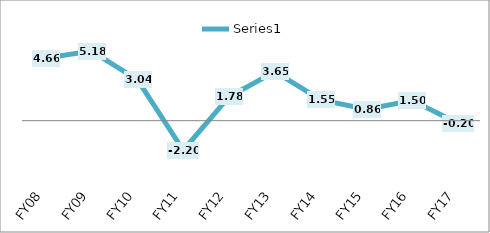
| Category | Series 0 |
|---|---|
| FY08 | 4.66 |
| FY09 | 5.18 |
| FY10 | 3.04 |
| FY11 | -2.2 |
| FY12 | 1.78 |
| FY13 | 3.65 |
| FY14 | 1.55 |
| FY15 | 0.86 |
| FY16 | 1.5 |
| FY17 | -0.2 |